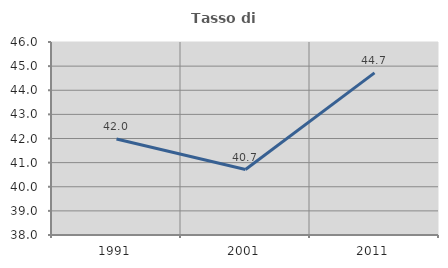
| Category | Tasso di occupazione   |
|---|---|
| 1991.0 | 41.979 |
| 2001.0 | 40.712 |
| 2011.0 | 44.718 |